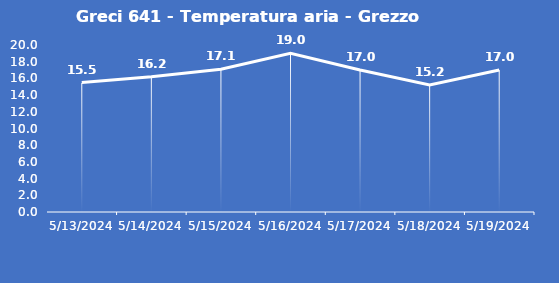
| Category | Greci 641 - Temperatura aria - Grezzo (°C) |
|---|---|
| 5/13/24 | 15.5 |
| 5/14/24 | 16.2 |
| 5/15/24 | 17.1 |
| 5/16/24 | 19 |
| 5/17/24 | 17 |
| 5/18/24 | 15.2 |
| 5/19/24 | 17 |